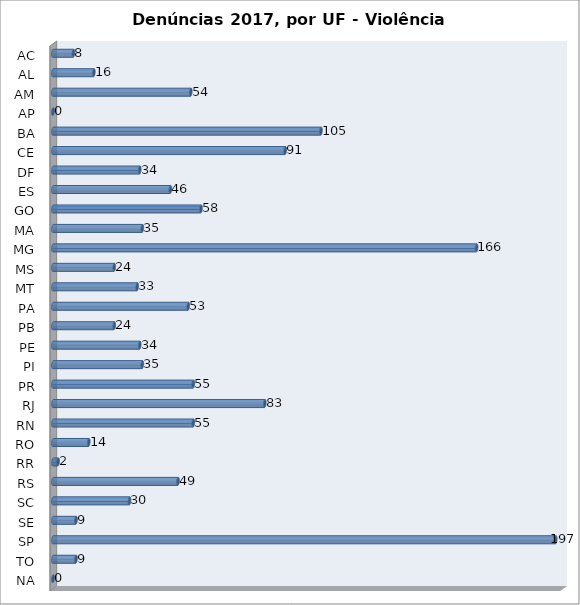
| Category | Series 0 |
|---|---|
| AC | 8 |
| AL | 16 |
| AM | 54 |
| AP | 0 |
| BA | 105 |
| CE | 91 |
| DF | 34 |
| ES | 46 |
| GO | 58 |
| MA | 35 |
| MG | 166 |
| MS | 24 |
| MT | 33 |
| PA | 53 |
| PB | 24 |
| PE | 34 |
| PI | 35 |
| PR | 55 |
| RJ | 83 |
| RN | 55 |
| RO | 14 |
| RR | 2 |
| RS | 49 |
| SC | 30 |
| SE | 9 |
| SP | 197 |
| TO | 9 |
| NA | 0 |